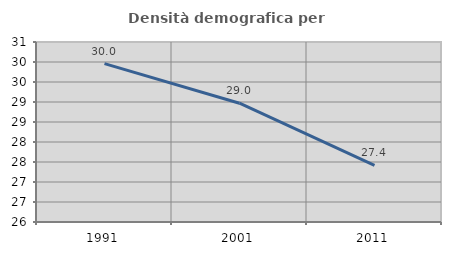
| Category | Densità demografica |
|---|---|
| 1991.0 | 29.958 |
| 2001.0 | 28.969 |
| 2011.0 | 27.416 |